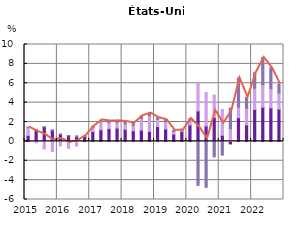
| Category | Coûts unitaires de la main d'œuvre | Bénéfices unitaires | Impôts unitaires moins subventions |
|---|---|---|---|
| 2015.0 | 0.602 | 0.87 | 0.004 |
| nan | 1.195 | -0.15 | 0.01 |
| nan | 1.484 | -0.784 | 0.009 |
| nan | 1.135 | -1.045 | 0.048 |
| 2016.0 | 0.716 | -0.47 | 0.05 |
| nan | 0.584 | -0.722 | 0.029 |
| nan | 0.466 | -0.487 | 0.107 |
| nan | 0.517 | 0.017 | 0.065 |
| 2017.0 | 1.015 | 0.431 | 0.121 |
| nan | 1.198 | 0.831 | 0.182 |
| nan | 1.311 | 0.644 | 0.145 |
| nan | 1.367 | 0.581 | 0.171 |
| 2018.0 | 1.243 | 0.56 | 0.248 |
| nan | 1.09 | 0.569 | 0.239 |
| nan | 1.157 | 1.204 | 0.277 |
| nan | 1.023 | 1.626 | 0.274 |
| 2019.0 | 1.527 | 0.743 | 0.181 |
| nan | 1.279 | 0.759 | 0.187 |
| nan | 0.75 | 0.275 | 0.116 |
| nan | 1.028 | 0.114 | 0.032 |
| 2020.0 | 1.685 | 0.503 | 0.179 |
| nan | 3.134 | 2.897 | -4.541 |
| nan | 1.591 | 3.444 | -4.748 |
| nan | 2.462 | 2.325 | -1.596 |
| 2021.0 | 0.627 | 2.658 | -1.419 |
| nan | -0.265 | 1.316 | 2.119 |
| nan | 2.447 | 1.095 | 3.011 |
| nan | 1.702 | 1.722 | 1.123 |
| 2022.0 | 3.287 | 2.211 | 1.587 |
| nan | 3.524 | 2.324 | 2.815 |
| nan | 3.456 | 1.996 | 2.144 |
| nan | 3.321 | 1.659 | 0.939 |